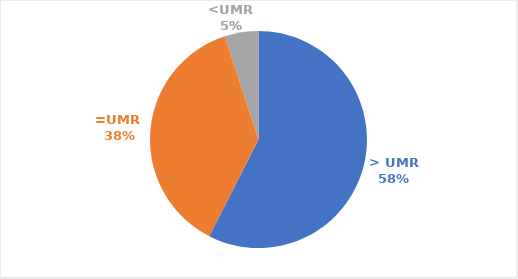
| Category | Indikator Pendapatan Rumah Tangga |
|---|---|
| > UMR | 23 |
| =UMR  | 15 |
| <UMR | 2 |